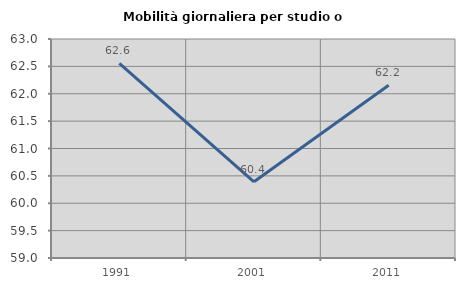
| Category | Mobilità giornaliera per studio o lavoro |
|---|---|
| 1991.0 | 62.556 |
| 2001.0 | 60.391 |
| 2011.0 | 62.154 |